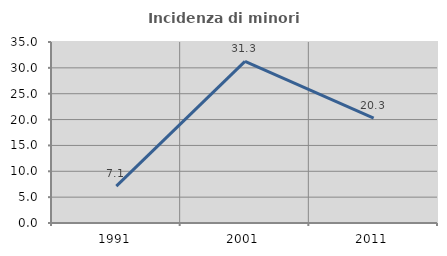
| Category | Incidenza di minori stranieri |
|---|---|
| 1991.0 | 7.143 |
| 2001.0 | 31.25 |
| 2011.0 | 20.29 |